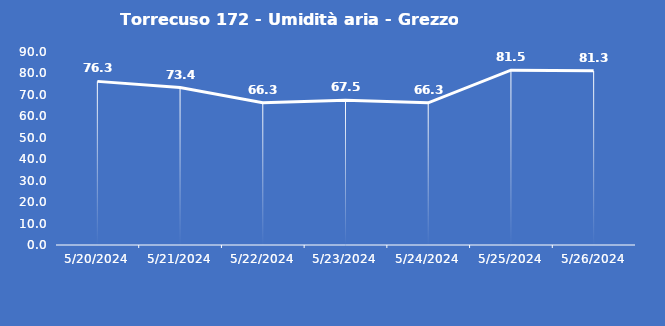
| Category | Torrecuso 172 - Umidità aria - Grezzo (%) |
|---|---|
| 5/20/24 | 76.3 |
| 5/21/24 | 73.4 |
| 5/22/24 | 66.3 |
| 5/23/24 | 67.5 |
| 5/24/24 | 66.3 |
| 5/25/24 | 81.5 |
| 5/26/24 | 81.3 |